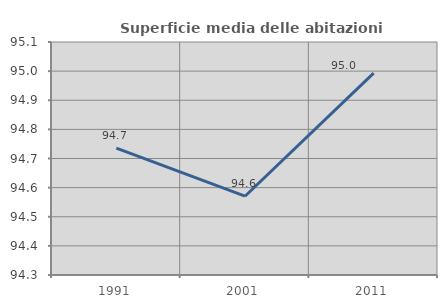
| Category | Superficie media delle abitazioni occupate |
|---|---|
| 1991.0 | 94.736 |
| 2001.0 | 94.57 |
| 2011.0 | 94.993 |